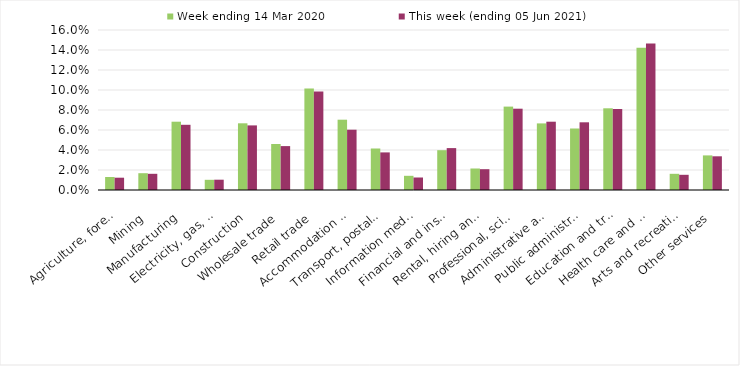
| Category | Week ending 14 Mar 2020 | This week (ending 05 Jun 2021) |
|---|---|---|
| Agriculture, forestry and fishing | 0.013 | 0.012 |
| Mining | 0.017 | 0.016 |
| Manufacturing | 0.068 | 0.065 |
| Electricity, gas, water and waste services | 0.01 | 0.01 |
| Construction | 0.067 | 0.065 |
| Wholesale trade | 0.046 | 0.044 |
| Retail trade | 0.102 | 0.099 |
| Accommodation and food services | 0.07 | 0.06 |
| Transport, postal and warehousing | 0.042 | 0.038 |
| Information media and telecommunications | 0.014 | 0.012 |
| Financial and insurance services | 0.04 | 0.042 |
| Rental, hiring and real estate services | 0.022 | 0.021 |
| Professional, scientific and technical services | 0.083 | 0.081 |
| Administrative and support services | 0.067 | 0.068 |
| Public administration and safety | 0.062 | 0.068 |
| Education and training | 0.082 | 0.081 |
| Health care and social assistance | 0.142 | 0.147 |
| Arts and recreation services | 0.016 | 0.015 |
| Other services | 0.035 | 0.034 |